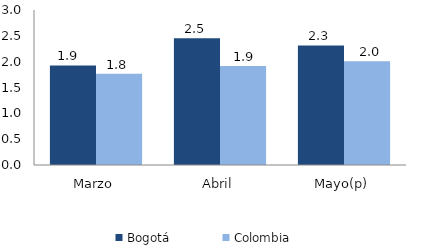
| Category | Bogotá | Colombia |
|---|---|---|
| Marzo | 1.926 | 1.767 |
| Abril | 2.455 | 1.917 |
| Mayo(p) | 2.314 | 2.008 |